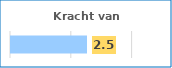
| Category | Series 0 |
|---|---|
| 0 | 2.5 |